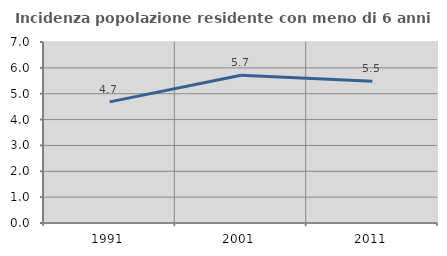
| Category | Incidenza popolazione residente con meno di 6 anni |
|---|---|
| 1991.0 | 4.684 |
| 2001.0 | 5.717 |
| 2011.0 | 5.48 |